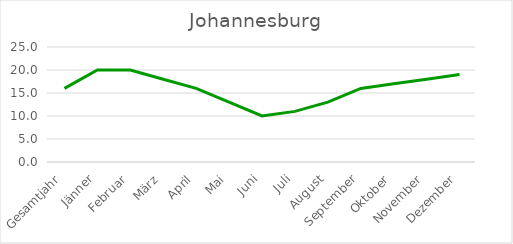
| Category | Johannesburg |
|---|---|
| Gesamtjahr | 16 |
| Jänner | 20 |
| Februar | 20 |
| März | 18 |
| April | 16 |
| Mai | 13 |
| Juni | 10 |
| Juli | 11 |
| August | 13 |
| September | 16 |
| Oktober | 17 |
| November | 18 |
| Dezember | 19 |